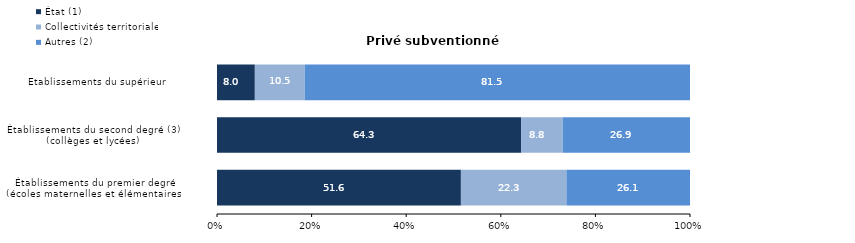
| Category | État (1) | Collectivités territoriales | Autres (2) |
|---|---|---|---|
| Établissements du premier degré
(écoles maternelles et élémentaires) | 51.564 | 22.316 | 26.12 |
| Établissements du second degré (3)
(collèges et lycées) | 64.282 | 8.819 | 26.899 |
| Établissements du supérieur      | 8.009 | 10.542 | 81.549 |